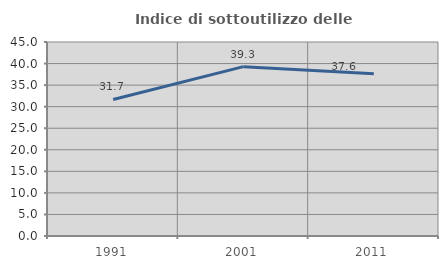
| Category | Indice di sottoutilizzo delle abitazioni  |
|---|---|
| 1991.0 | 31.678 |
| 2001.0 | 39.281 |
| 2011.0 | 37.61 |